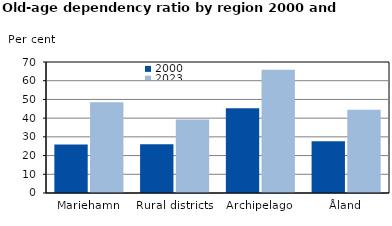
| Category | 2000 | 2023 |
|---|---|---|
| Mariehamn | 25.966 | 48.448 |
| Rural districts | 26.071 | 39.307 |
| Archipelago | 45.282 | 65.924 |
| Åland | 27.61 | 44.495 |